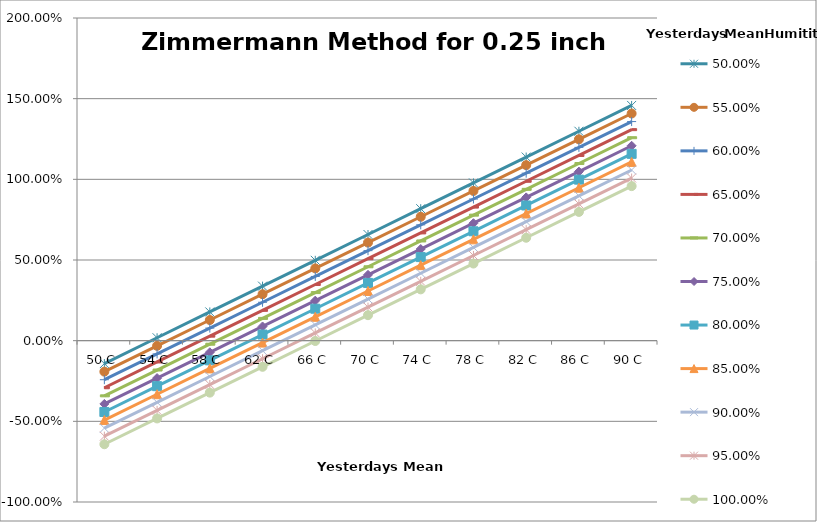
| Category | 50,00% | 55,00% | 60,00% | 65,00% | 70,00% | 75,00% | 80,00% | 85,00% | 90,00% | 95,00% | 100,00% |
|---|---|---|---|---|---|---|---|---|---|---|---|
| 50.0 | -0.142 | -0.192 | -0.242 | -0.292 | -0.342 | -0.392 | -0.442 | -0.492 | -0.542 | -0.592 | -0.642 |
| 54.0 | 0.018 | -0.032 | -0.082 | -0.132 | -0.182 | -0.232 | -0.282 | -0.332 | -0.382 | -0.432 | -0.482 |
| 58.0 | 0.178 | 0.128 | 0.078 | 0.028 | -0.022 | -0.072 | -0.122 | -0.172 | -0.222 | -0.272 | -0.322 |
| 62.0 | 0.338 | 0.288 | 0.238 | 0.188 | 0.138 | 0.088 | 0.038 | -0.012 | -0.062 | -0.112 | -0.162 |
| 66.0 | 0.498 | 0.448 | 0.398 | 0.348 | 0.298 | 0.248 | 0.198 | 0.148 | 0.098 | 0.048 | -0.002 |
| 70.0 | 0.658 | 0.608 | 0.558 | 0.508 | 0.458 | 0.408 | 0.358 | 0.308 | 0.258 | 0.208 | 0.158 |
| 74.0 | 0.818 | 0.768 | 0.718 | 0.668 | 0.618 | 0.568 | 0.518 | 0.468 | 0.418 | 0.368 | 0.318 |
| 78.0 | 0.978 | 0.928 | 0.878 | 0.828 | 0.778 | 0.728 | 0.678 | 0.628 | 0.578 | 0.528 | 0.478 |
| 82.0 | 1.138 | 1.088 | 1.038 | 0.988 | 0.938 | 0.888 | 0.838 | 0.788 | 0.738 | 0.688 | 0.638 |
| 86.0 | 1.298 | 1.248 | 1.198 | 1.148 | 1.098 | 1.048 | 0.998 | 0.948 | 0.898 | 0.848 | 0.798 |
| 90.0 | 1.458 | 1.408 | 1.358 | 1.308 | 1.258 | 1.208 | 1.158 | 1.108 | 1.058 | 1.008 | 0.958 |